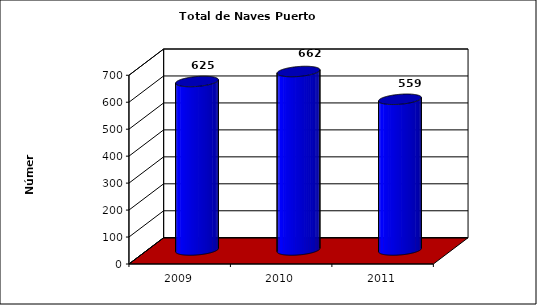
| Category | Series 0 |
|---|---|
| 2009.0 | 625 |
| 2010.0 | 662 |
| 2011.0 | 559 |